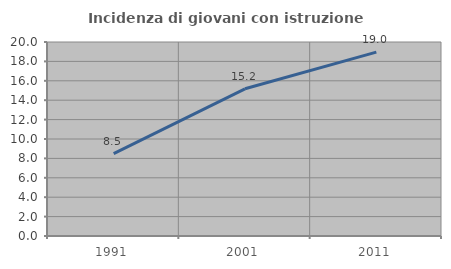
| Category | Incidenza di giovani con istruzione universitaria |
|---|---|
| 1991.0 | 8.496 |
| 2001.0 | 15.175 |
| 2011.0 | 18.956 |